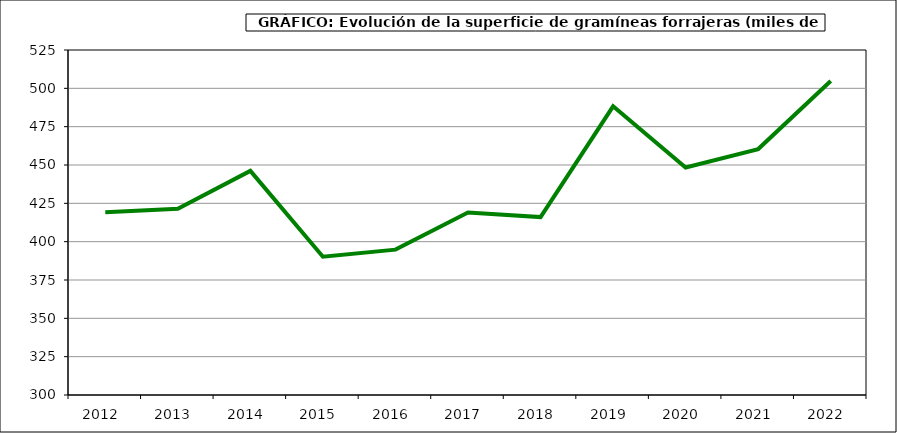
| Category | Superficie |
|---|---|
| 2012.0 | 419.197 |
| 2013.0 | 421.523 |
| 2014.0 | 446.163 |
| 2015.0 | 390.211 |
| 2016.0 | 394.792 |
| 2017.0 | 418.976 |
| 2018.0 | 416.034 |
| 2019.0 | 488.269 |
| 2020.0 | 448.392 |
| 2021.0 | 460.381 |
| 2022.0 | 504.805 |